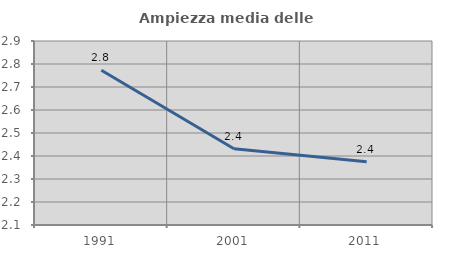
| Category | Ampiezza media delle famiglie |
|---|---|
| 1991.0 | 2.773 |
| 2001.0 | 2.432 |
| 2011.0 | 2.375 |